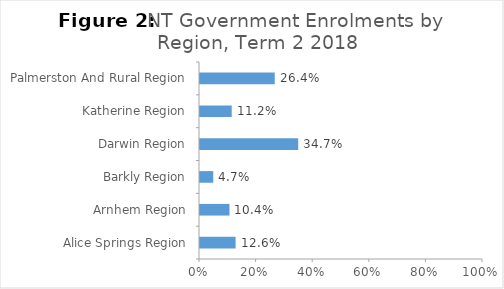
| Category | Series 0 |
|---|---|
| Alice Springs Region | 0.126 |
| Arnhem Region | 0.104 |
| Barkly Region | 0.047 |
| Darwin Region | 0.347 |
| Katherine Region | 0.112 |
| Palmerston And Rural Region | 0.264 |